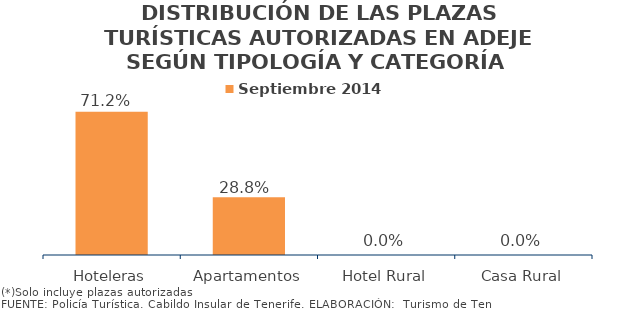
| Category | Septiembre 2014 |
|---|---|
| Hoteleras | 0.712 |
| Apartamentos | 0.288 |
| Hotel Rural | 0 |
| Casa Rural | 0 |